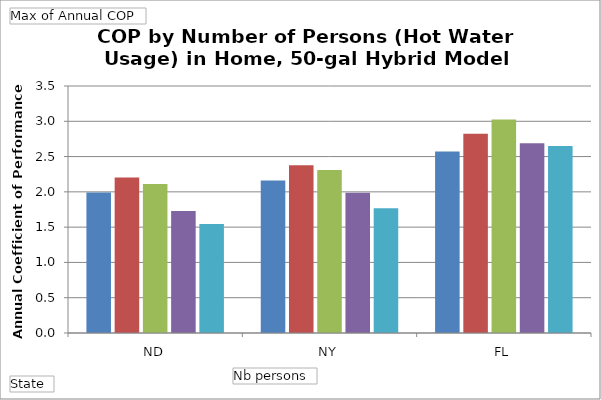
| Category | 1 | 2 | 3 | 4 | 5+ |
|---|---|---|---|---|---|
| ND | 1.992 | 2.205 | 2.111 | 1.729 | 1.545 |
| NY | 2.16 | 2.378 | 2.309 | 1.987 | 1.768 |
| FL | 2.572 | 2.822 | 3.025 | 2.69 | 2.65 |